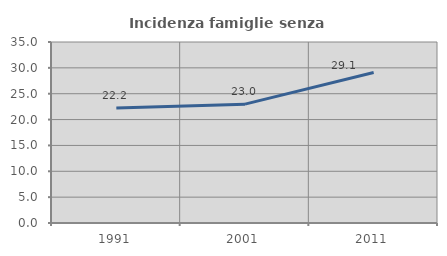
| Category | Incidenza famiglie senza nuclei |
|---|---|
| 1991.0 | 22.242 |
| 2001.0 | 22.984 |
| 2011.0 | 29.098 |